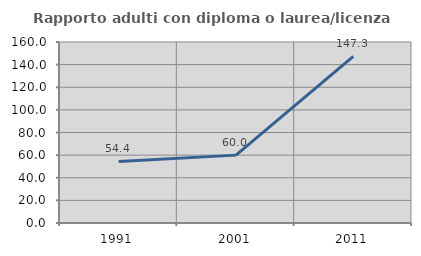
| Category | Rapporto adulti con diploma o laurea/licenza media  |
|---|---|
| 1991.0 | 54.428 |
| 2001.0 | 60 |
| 2011.0 | 147.283 |